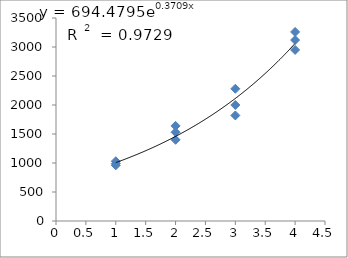
| Category | Series 0 |
|---|---|
| 1.0 | 960 |
| 1.0 | 990 |
| 1.0 | 1030 |
| 2.0 | 1530 |
| 2.0 | 1400 |
| 2.0 | 1640 |
| 3.0 | 2280 |
| 3.0 | 2000 |
| 3.0 | 1820 |
| 4.0 | 3260 |
| 4.0 | 2950 |
| 4.0 | 3120 |